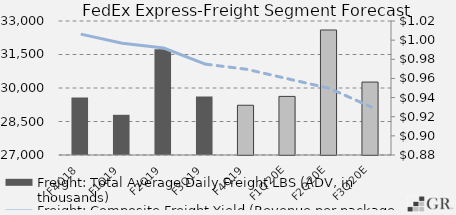
| Category | Freight: Total Average Daily Freight LBS (ADV, in thousands) |
|---|---|
|  F4Q18  | 29576 |
|  F1Q19  | 28800 |
|  F2Q19  | 31733.7 |
|  F3Q19  | 29617 |
|  F4Q19  | 29228 |
|  F1Q20E  | 29623.744 |
|  F2Q20E  | 32597.185 |
|  F3Q20E  | 30265.937 |